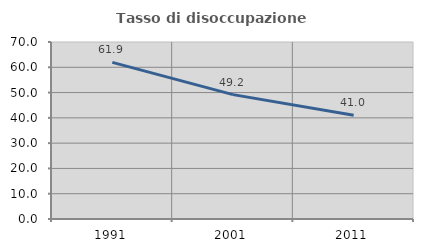
| Category | Tasso di disoccupazione giovanile  |
|---|---|
| 1991.0 | 61.938 |
| 2001.0 | 49.194 |
| 2011.0 | 41.026 |